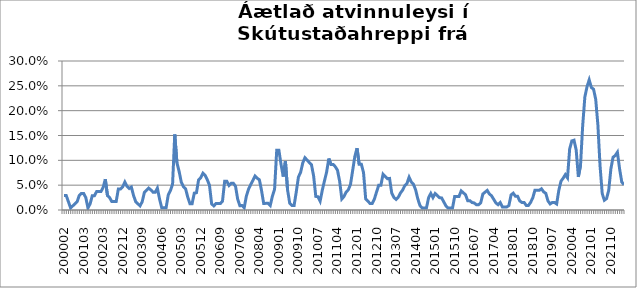
| Category | Series 0 |
|---|---|
| 200002 | 0.029 |
| 200003 | 0.029 |
| 200004 | 0.017 |
| 200005 | 0.004 |
| 200010 | 0.008 |
| 200011 | 0.012 |
| 200012 | 0.017 |
| 200101 | 0.029 |
| 200102 | 0.033 |
| 200103 | 0.033 |
| 200104 | 0.025 |
| 200105 | 0.004 |
| 200109 | 0.012 |
| 200110 | 0.029 |
| 200111 | 0.029 |
| 200112 | 0.037 |
| 200201 | 0.037 |
| 200202 | 0.037 |
| 200203 | 0.045 |
| 200204 | 0.062 |
| 200205 | 0.029 |
| 200206 | 0.025 |
| 200207 | 0.017 |
| 200208 | 0.017 |
| 200209 | 0.017 |
| 200210 | 0.042 |
| 200211 | 0.042 |
| 200212 | 0.046 |
| 200301 | 0.056 |
| 200302 | 0.048 |
| 200303 | 0.043 |
| 200304 | 0.046 |
| 200305 | 0.029 |
| 200306 | 0.017 |
| 200307 | 0.013 |
| 200308 | 0.008 |
| 200309 | 0.017 |
| 200310 | 0.035 |
| 200311 | 0.04 |
| 200312 | 0.044 |
| 200401 | 0.04 |
| 200402 | 0.036 |
| 200403 | 0.036 |
| 200404 | 0.044 |
| 200405 | 0.022 |
| 200406 | 0.004 |
| 200407 | 0.004 |
| 200408 | 0.004 |
| 200409 | 0.03 |
| 200410 | 0.039 |
| 200411 | 0.052 |
| 200412 | 0.152 |
| 200501 | 0.095 |
| 200502 | 0.078 |
| 200503 | 0.056 |
| 200504 | 0.047 |
| 200505 | 0.043 |
| 200506 | 0.026 |
| 200507 | 0.013 |
| 200508 | 0.013 |
| 200509 | 0.034 |
| 200510 | 0.035 |
| 200511 | 0.061 |
| 200512 | 0.065 |
| 200601 | 0.074 |
| 200602 | 0.07 |
| 200603 | 0.061 |
| 200604 | 0.05 |
| 200605 | 0.012 |
| 200606 | 0.008 |
| 200607 | 0.013 |
| 200608 | 0.013 |
| 200609 | 0.013 |
| 200610 | 0.018 |
| 200611 | 0.058 |
| 200612 | 0.058 |
| 200701 | 0.049 |
| 200702 | 0.054 |
| 200703 | 0.054 |
| 200704 | 0.048 |
| 200705 | 0.022 |
| 200706 | 0.009 |
| 200707 | 0.009 |
| 200708 | 0.004 |
| 200710 | 0.028 |
| 200711 | 0.042 |
| 200712 | 0.051 |
| 200801 | 0.059 |
| 200802 | 0.068 |
| 200803 | 0.064 |
| 200804 | 0.061 |
| 200805 | 0.039 |
| 200806 | 0.013 |
| 200807 | 0.013 |
| 200808 | 0.013 |
| 200809 | 0.009 |
| 200810 | 0.028 |
| 200811 | 0.042 |
| 200812 | 0.12 |
| 200901 | 0.12 |
| 200902 | 0.091 |
| 200903 | 0.067 |
| 200904 | 0.098 |
| 200905 | 0.04 |
| 200906 | 0.013 |
| 200907 | 0.009 |
| 200908 | 0.009 |
| 200909 | 0.036 |
| 200910 | 0.066 |
| 200911 | 0.076 |
| 200912 | 0.095 |
| 201001 | 0.105 |
| 201002 | 0.1 |
| 201003 | 0.096 |
| 201004 | 0.091 |
| 201005 | 0.068 |
| 201006 | 0.027 |
| 201007 | 0.027 |
| 201008 | 0.018 |
| 201009 | 0.04 |
| 201010 | 0.059 |
| 201011 | 0.077 |
| 201012 | 0.104 |
| 201101 | 0.092 |
| 201102 | 0.092 |
| 201103 | 0.087 |
| 201104 | 0.08 |
| 201105 | 0.058 |
| 201106 | 0.022 |
| 201107 | 0.027 |
| 201108 | 0.036 |
| 201109 | 0.041 |
| 201110 | 0.052 |
| 201111 | 0.08 |
| 201112 | 0.108 |
| 201201 | 0.124 |
| 201202 | 0.092 |
| 201203 | 0.092 |
| 201204 | 0.075 |
| 201205 | 0.022 |
| 201206 | 0.018 |
| 201207 | 0.013 |
| 201208 | 0.013 |
| 201209 | 0.022 |
| 201210 | 0.036 |
| 201211 | 0.05 |
| 201212 | 0.05 |
| 201301 | 0.072 |
| 201302 | 0.068 |
| 201303 | 0.063 |
| 201304 | 0.064 |
| 201305 | 0.034 |
| 201306 | 0.025 |
| 201307 | 0.021 |
| 201308 | 0.026 |
| 201309 | 0.034 |
| 201310 | 0.04 |
| 201311 | 0.049 |
| 201312 | 0.053 |
| 201401 | 0.066 |
| 201402 | 0.057 |
| 201403 | 0.052 |
| 201404 | 0.041 |
| 201405 | 0.023 |
| 201406 | 0.009 |
| 201407 | 0.004 |
| 201408 | 0.004 |
| 201409 | 0.004 |
| 201410 | 0.025 |
| 201411 | 0.033 |
| 201412 | 0.025 |
| 201501 | 0.033 |
| 201502 | 0.029 |
| 201503 | 0.025 |
| 201504 | 0.024 |
| 201505 | 0.016 |
| 201506 | 0.008 |
| 201507 | 0.004 |
| 201508 | 0.004 |
| 201509 | 0.004 |
| 201510 | 0.027 |
| 201511 | 0.027 |
| 201512 | 0.027 |
| 201601 | 0.038 |
| 201602 | 0.035 |
| 201603 | 0.031 |
| 201604 | 0.019 |
| 201605 | 0.019 |
| 201606 | 0.015 |
| 201607 | 0.014 |
| 201608 | 0.011 |
| 201609 | 0.011 |
| 201610 | 0.014 |
| 201611 | 0.032 |
| 201612 | 0.036 |
| 201701 | 0.039 |
| 201702 | 0.032 |
| 201703 | 0.029 |
| 201704 | 0.021 |
| 201705 | 0.014 |
| 201706 | 0.011 |
| 201707 | 0.015 |
| 201708 | 0.006 |
| 201709 | 0.006 |
| 201710 | 0.006 |
| 201711 | 0.009 |
| 201712 | 0.03 |
| 201801 | 0.034 |
| 201802 | 0.028 |
| 201803 | 0.028 |
| 201804 | 0.018 |
| 201805 | 0.015 |
| 201806 | 0.015 |
| 201807 | 0.009 |
| 201808 | 0.009 |
| 201809 | 0.015 |
| 201810 | 0.025 |
| 201811 | 0.04 |
| 201812 | 0.04 |
| 201901 | 0.04 |
| 201902 | 0.043 |
| 201903 | 0.037 |
| 201904 | 0.034 |
| 201905 | 0.018 |
| 201906 | 0.012 |
| 201907 | 0.015 |
| 201908 | 0.015 |
| 201909 | 0.012 |
| 201910 | 0.04 |
| 201911 | 0.058 |
| 201912 | 0.064 |
| 202001 | 0.071 |
| 202002 | 0.065 |
| 202003 | 0.123 |
| 202004 | 0.139 |
| 202005 | 0.141 |
| 202006 | 0.121 |
| 202007 | 0.067 |
| 202008 | 0.09 |
| 202009 | 0.17 |
| 202010 | 0.228 |
| 202011 | 0.248 |
| 202012 | 0.262 |
| 202101 | 0.247 |
| 202102 | 0.243 |
| 202103 | 0.223 |
| 202104 | 0.172 |
| 202105 | 0.089 |
| 202106 | 0.033 |
| 202107 | 0.02 |
| 202108 | 0.023 |
| 202109 | 0.04 |
| 202110 | 0.083 |
| 202111 | 0.106 |
| 202112 | 0.11 |
| 202201 | 0.116 |
| 202202 | 0.083 |
| 202203 | 0.056 |
| 202204 | 0.051 |